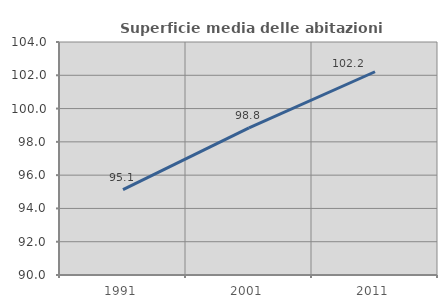
| Category | Superficie media delle abitazioni occupate |
|---|---|
| 1991.0 | 95.134 |
| 2001.0 | 98.846 |
| 2011.0 | 102.213 |